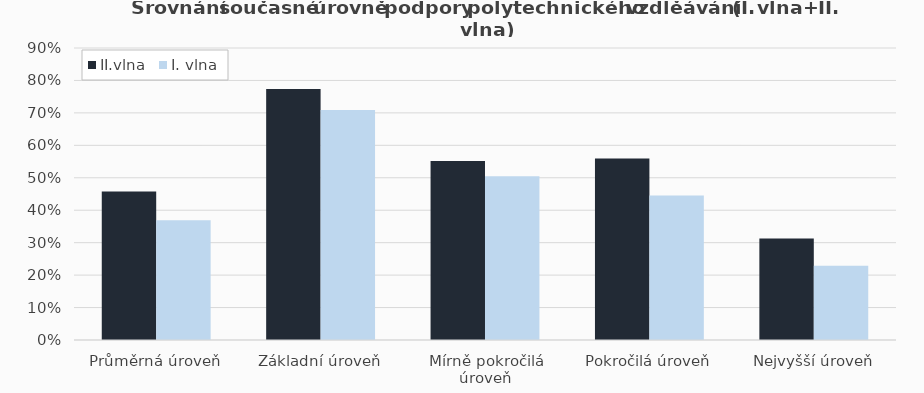
| Category | II.vlna | I. vlna |
|---|---|---|
| Průměrná úroveň | 0.458 | 0.369 |
| Základní úroveň | 0.774 | 0.709 |
| Mírně pokročilá úroveň | 0.552 | 0.505 |
| Pokročilá úroveň | 0.56 | 0.445 |
| Nejvyšší úroveň | 0.313 | 0.229 |